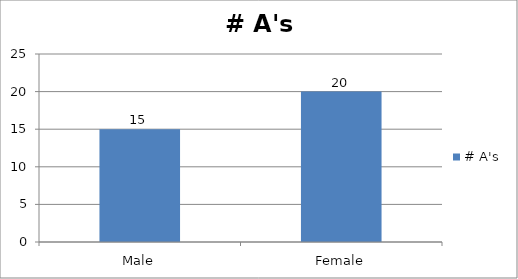
| Category | # A's |
|---|---|
| Male | 15 |
| Female | 20 |